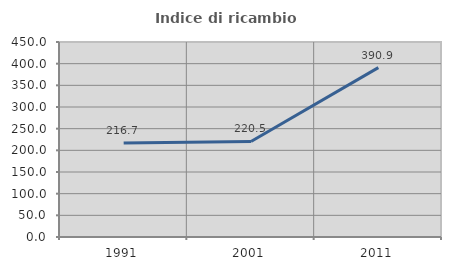
| Category | Indice di ricambio occupazionale  |
|---|---|
| 1991.0 | 216.667 |
| 2001.0 | 220.513 |
| 2011.0 | 390.909 |